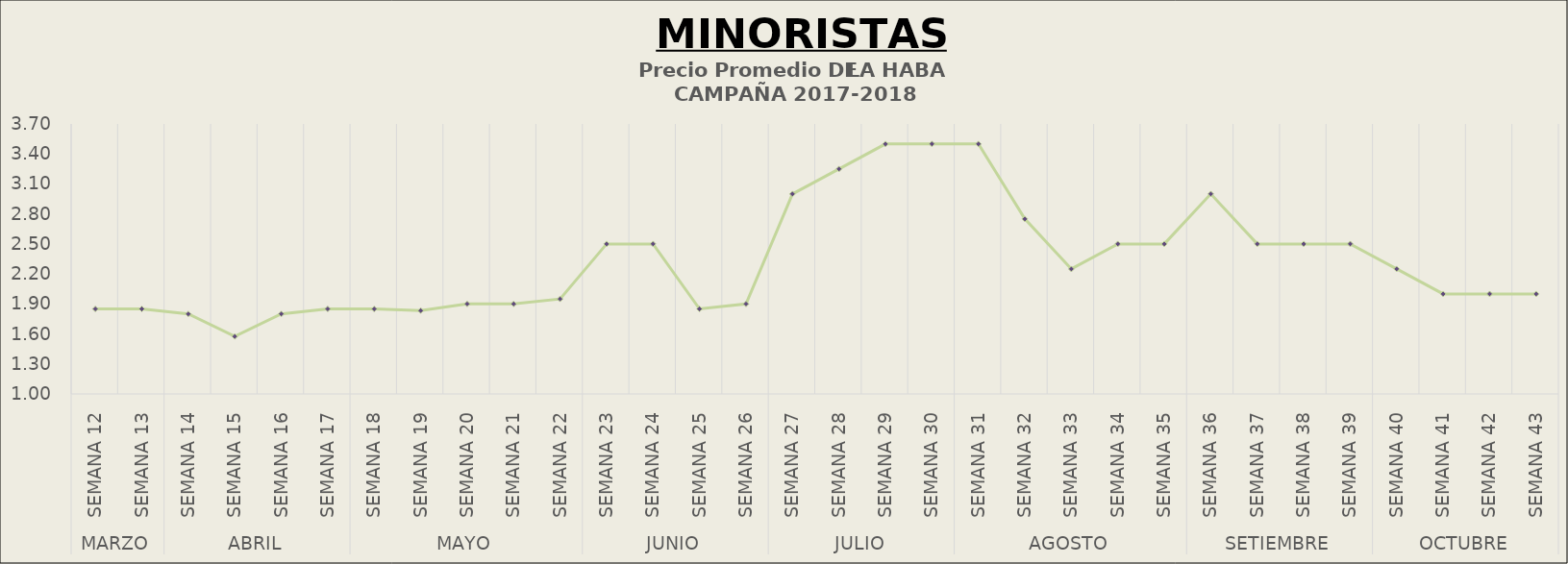
| Category | Precio Promedio ( S/.x Kg.) |
|---|---|
| 0 | 1.85 |
| 1 | 1.85 |
| 2 | 1.8 |
| 3 | 1.575 |
| 4 | 1.8 |
| 5 | 1.85 |
| 6 | 1.85 |
| 7 | 1.833 |
| 8 | 1.9 |
| 9 | 1.9 |
| 10 | 1.95 |
| 11 | 2.5 |
| 12 | 2.5 |
| 13 | 1.85 |
| 14 | 1.9 |
| 15 | 3 |
| 16 | 3.25 |
| 17 | 3.5 |
| 18 | 3.5 |
| 19 | 3.5 |
| 20 | 2.75 |
| 21 | 2.25 |
| 22 | 2.5 |
| 23 | 2.5 |
| 24 | 3 |
| 25 | 2.5 |
| 26 | 2.5 |
| 27 | 2.5 |
| 28 | 2.25 |
| 29 | 2 |
| 30 | 2 |
| 31 | 2 |